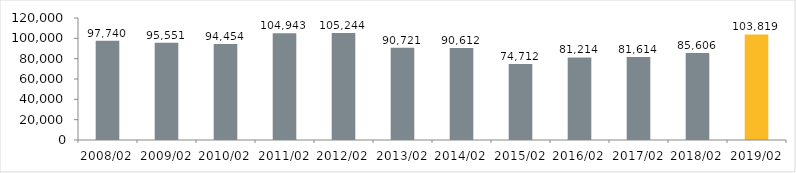
| Category | Series 0 |
|---|---|
| 2008/02 | 97740 |
| 2009/02 | 95551 |
| 2010/02 | 94454 |
| 2011/02 | 104943 |
| 2012/02 | 105244 |
| 2013/02 | 90721 |
| 2014/02 | 90612 |
| 2015/02 | 74712 |
| 2016/02 | 81214 |
| 2017/02 | 81614 |
| 2018/02 | 85606 |
| 2019/02 | 103819 |